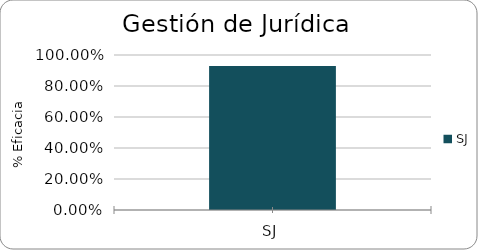
| Category | % Eficacia total |
|---|---|
| SJ | 0.929 |